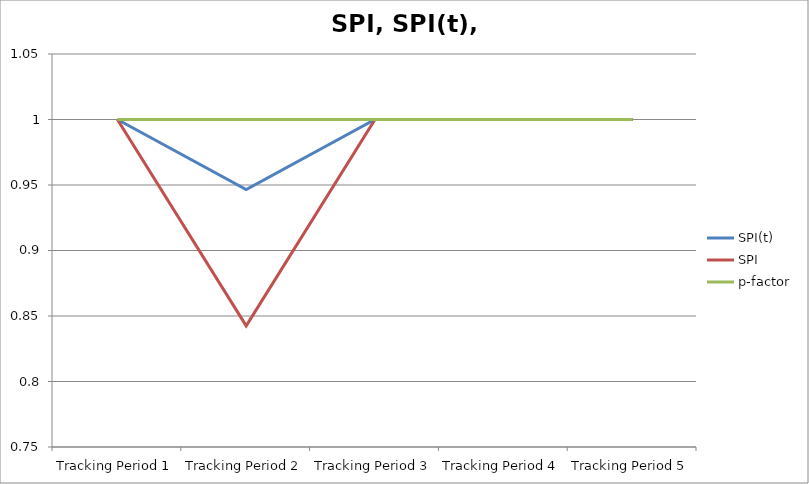
| Category | SPI(t) | SPI | p-factor |
|---|---|---|---|
| Tracking Period 1 | 1 | 1 | 1 |
| Tracking Period 2 | 0.947 | 0.843 | 1 |
| Tracking Period 3 | 1 | 1 | 1 |
| Tracking Period 4 | 1 | 1 | 1 |
| Tracking Period 5 | 1 | 1 | 1 |